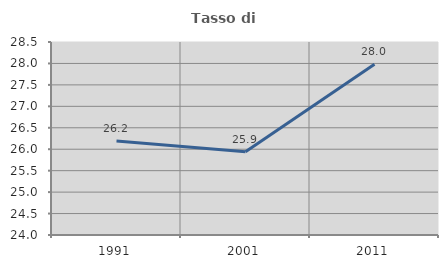
| Category | Tasso di occupazione   |
|---|---|
| 1991.0 | 26.19 |
| 2001.0 | 25.943 |
| 2011.0 | 27.982 |